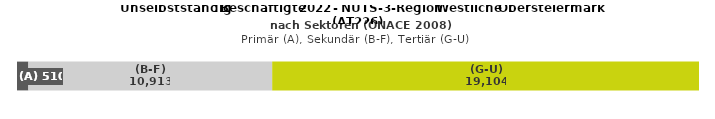
| Category | (A) | (B-F) | (G-U) |
|---|---|---|---|
| 0 | 510 | 10913 | 19104 |